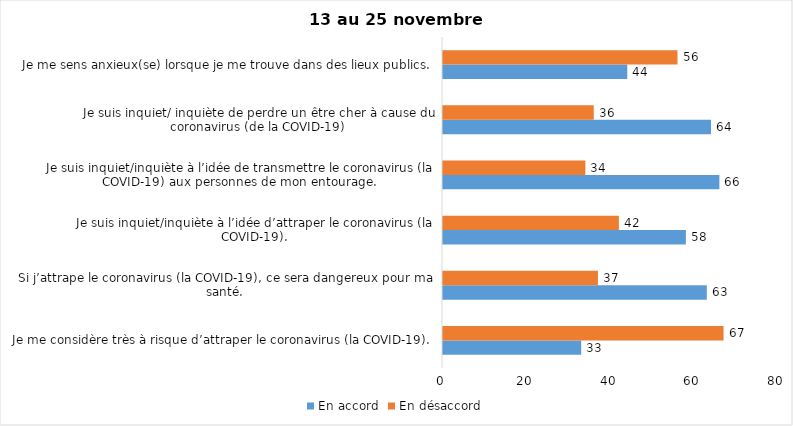
| Category | En accord | En désaccord |
|---|---|---|
| Je me considère très à risque d’attraper le coronavirus (la COVID-19). | 33 | 67 |
| Si j’attrape le coronavirus (la COVID-19), ce sera dangereux pour ma santé. | 63 | 37 |
| Je suis inquiet/inquiète à l’idée d’attraper le coronavirus (la COVID-19). | 58 | 42 |
| Je suis inquiet/inquiète à l’idée de transmettre le coronavirus (la COVID-19) aux personnes de mon entourage. | 66 | 34 |
| Je suis inquiet/ inquiète de perdre un être cher à cause du coronavirus (de la COVID-19) | 64 | 36 |
| Je me sens anxieux(se) lorsque je me trouve dans des lieux publics. | 44 | 56 |